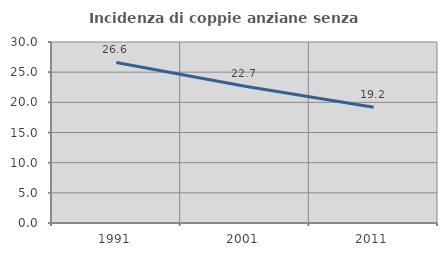
| Category | Incidenza di coppie anziane senza figli  |
|---|---|
| 1991.0 | 26.615 |
| 2001.0 | 22.671 |
| 2011.0 | 19.178 |